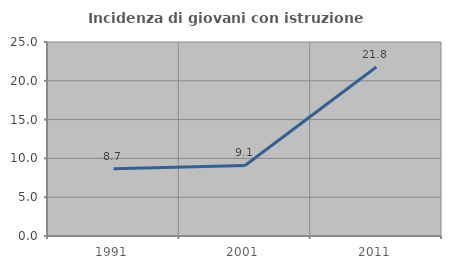
| Category | Incidenza di giovani con istruzione universitaria |
|---|---|
| 1991.0 | 8.671 |
| 2001.0 | 9.091 |
| 2011.0 | 21.782 |